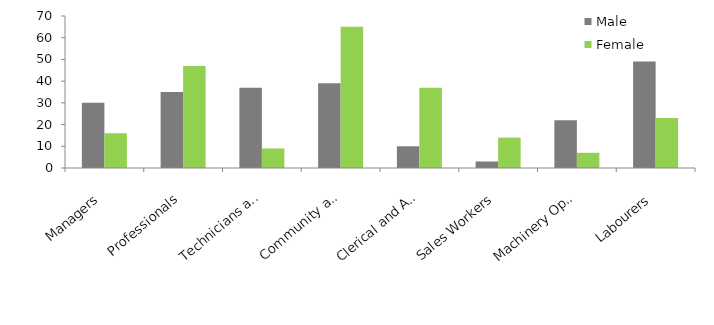
| Category | Male | Female |
|---|---|---|
| Managers | 30 | 16 |
| Professionals | 35 | 47 |
| Technicians and Trades Workers | 37 | 9 |
| Community and Personal Service Workers | 39 | 65 |
| Clerical and Administrative Workers | 10 | 37 |
| Sales Workers | 3 | 14 |
| Machinery Operators and Drivers | 22 | 7 |
| Labourers | 49 | 23 |